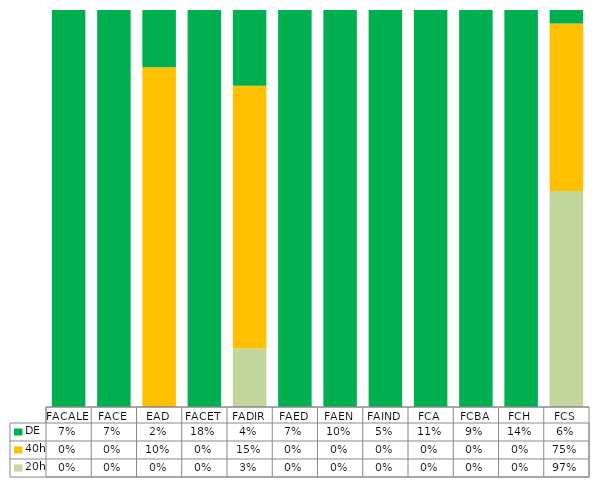
| Category | 20h | 40h | DE |
|---|---|---|---|
| FACALE | 0 | 0 | 0.066 |
| FACE | 0 | 0 | 0.073 |
| EAD | 0 | 0.1 | 0.017 |
| FACET | 0 | 0 | 0.182 |
| FADIR | 0.033 | 0.15 | 0.043 |
| FAED | 0 | 0 | 0.073 |
| FAEN | 0 | 0 | 0.103 |
| FAIND | 0 | 0 | 0.049 |
| FCA | 0 | 0 | 0.109 |
| FCBA | 0 | 0 | 0.086 |
| FCH | 0 | 0 | 0.139 |
| FCS | 0.967 | 0.75 | 0.06 |